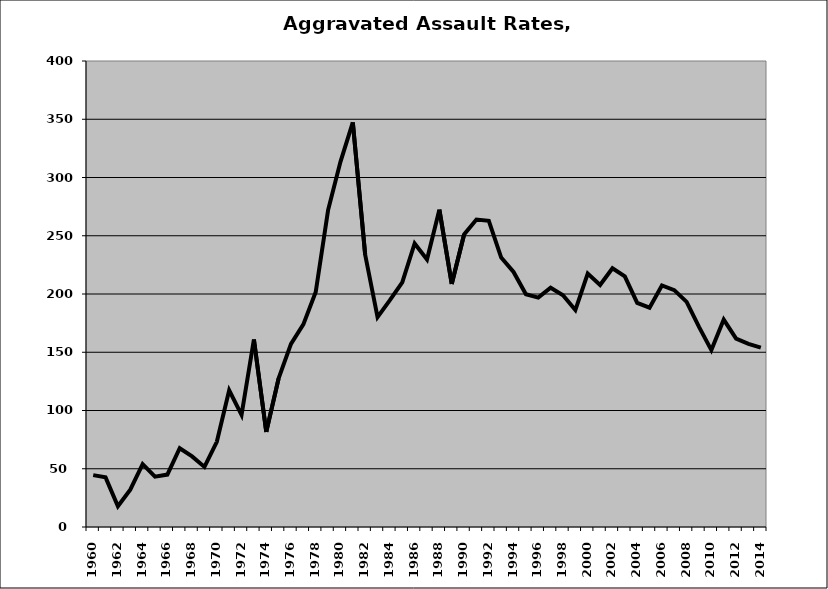
| Category | Aggravated Assault |
|---|---|
| 1960.0 | 44.537 |
| 1961.0 | 42.604 |
| 1962.0 | 17.808 |
| 1963.0 | 32.047 |
| 1964.0 | 53.936 |
| 1965.0 | 43.235 |
| 1966.0 | 44.985 |
| 1967.0 | 67.619 |
| 1968.0 | 60.635 |
| 1969.0 | 51.562 |
| 1970.0 | 73.101 |
| 1971.0 | 117.353 |
| 1972.0 | 96.232 |
| 1973.0 | 160.907 |
| 1974.0 | 81.616 |
| 1975.0 | 127.54 |
| 1976.0 | 157.179 |
| 1977.0 | 173.892 |
| 1978.0 | 201.651 |
| 1979.0 | 272 |
| 1980.0 | 313.464 |
| 1981.0 | 347.358 |
| 1982.0 | 233.665 |
| 1983.0 | 180.156 |
| 1984.0 | 194.716 |
| 1985.0 | 210.02 |
| 1986.0 | 243.393 |
| 1987.0 | 229.592 |
| 1988.0 | 272.399 |
| 1989.0 | 208.632 |
| 1990.0 | 251.109 |
| 1991.0 | 263.913 |
| 1992.0 | 262.876 |
| 1993.0 | 231.277 |
| 1994.0 | 218.908 |
| 1995.0 | 199.792 |
| 1996.0 | 196.881 |
| 1997.0 | 205.417 |
| 1998.0 | 198.96 |
| 1999.0 | 186.196 |
| 2000.0 | 217.505 |
| 2001.0 | 207.796 |
| 2002.0 | 222.12 |
| 2003.0 | 215.092 |
| 2004.0 | 192.335 |
| 2005.0 | 188.287 |
| 2006.0 | 207.377 |
| 2007.0 | 203.317 |
| 2008.0 | 193.253 |
| 2009.0 | 171.79 |
| 2010.0 | 151.874 |
| 2011.0 | 178.019 |
| 2012.0 | 161.63 |
| 2013.0 | 157.23 |
| 2014.0 | 153.898 |